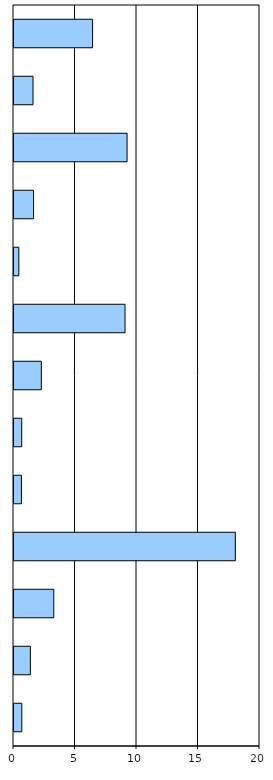
| Category | Series 0 |
|---|---|
| sonstige FB | 0.634 |
| Z00 - Z99 | 1.33 |
| S00 - T98 | 3.233 |
| M00 - M99 | 17.995 |
| L00 - L99 | 0.603 |
| K00 - K93 | 0.628 |
| J00 - J99 | 2.223 |
| I00 - I99 | 9.026 |
| H00 - H59 | 0.392 |
| G00 - G99 | 1.59 |
| F00 - F99 | 9.193 |
| E00 - E90 | 1.546 |
| C00 - D48 | 6.391 |